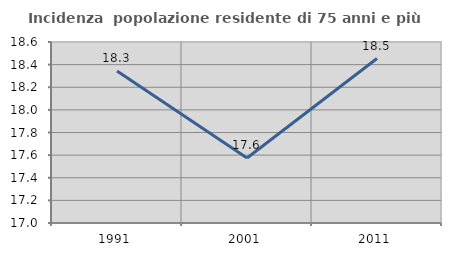
| Category | Incidenza  popolazione residente di 75 anni e più |
|---|---|
| 1991.0 | 18.343 |
| 2001.0 | 17.575 |
| 2011.0 | 18.454 |